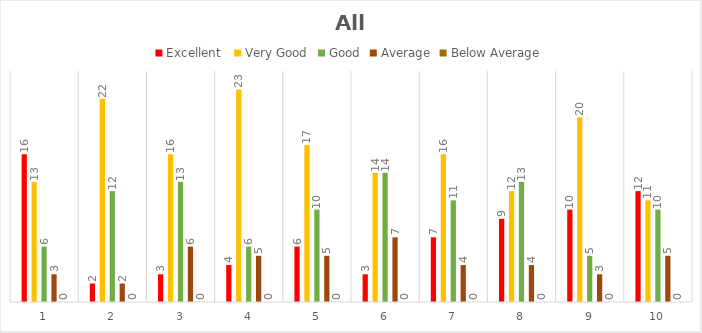
| Category | Excellent  | Very Good | Good | Average | Below Average |
|---|---|---|---|---|---|
| 0 | 16 | 13 | 6 | 3 | 0 |
| 1 | 2 | 22 | 12 | 2 | 0 |
| 2 | 3 | 16 | 13 | 6 | 0 |
| 3 | 4 | 23 | 6 | 5 | 0 |
| 4 | 6 | 17 | 10 | 5 | 0 |
| 5 | 3 | 14 | 14 | 7 | 0 |
| 6 | 7 | 16 | 11 | 4 | 0 |
| 7 | 9 | 12 | 13 | 4 | 0 |
| 8 | 10 | 20 | 5 | 3 | 0 |
| 9 | 12 | 11 | 10 | 5 | 0 |